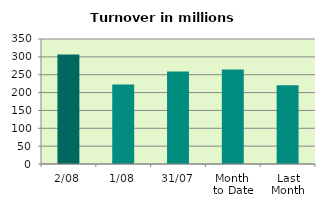
| Category | Series 0 |
|---|---|
| 2/08 | 306.266 |
| 1/08 | 222.256 |
| 31/07 | 259.218 |
| Month 
to Date | 264.261 |
| Last
Month | 220.762 |